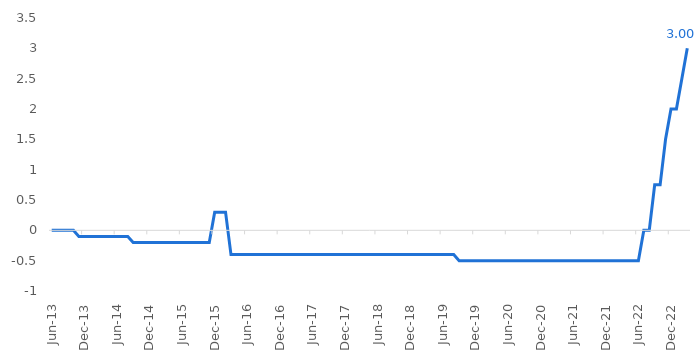
| Category | Taxa de depósito BCE |
|---|---|
| 2013-06-01 | 0 |
| 2013-07-01 | 0 |
| 2013-08-01 | 0 |
| 2013-09-01 | 0 |
| 2013-10-01 | 0 |
| 2013-11-01 | -0.1 |
| 2013-12-01 | -0.1 |
| 2014-01-01 | -0.1 |
| 2014-02-01 | -0.1 |
| 2014-03-01 | -0.1 |
| 2014-04-01 | -0.1 |
| 2014-05-01 | -0.1 |
| 2014-06-01 | -0.1 |
| 2014-07-01 | -0.1 |
| 2014-08-01 | -0.1 |
| 2014-09-01 | -0.2 |
| 2014-10-01 | -0.2 |
| 2014-11-01 | -0.2 |
| 2014-12-01 | -0.2 |
| 2015-01-01 | -0.2 |
| 2015-02-01 | -0.2 |
| 2015-03-01 | -0.2 |
| 2015-04-01 | -0.2 |
| 2015-05-01 | -0.2 |
| 2015-06-01 | -0.2 |
| 2015-07-01 | -0.2 |
| 2015-08-01 | -0.2 |
| 2015-09-01 | -0.2 |
| 2015-10-01 | -0.2 |
| 2015-11-01 | -0.2 |
| 2015-12-01 | 0.3 |
| 2016-01-01 | 0.3 |
| 2016-02-01 | 0.3 |
| 2016-03-01 | -0.4 |
| 2016-04-01 | -0.4 |
| 2016-05-01 | -0.4 |
| 2016-06-01 | -0.4 |
| 2016-07-01 | -0.4 |
| 2016-08-01 | -0.4 |
| 2016-09-01 | -0.4 |
| 2016-10-01 | -0.4 |
| 2016-11-01 | -0.4 |
| 2016-12-01 | -0.4 |
| 2017-01-01 | -0.4 |
| 2017-02-01 | -0.4 |
| 2017-03-01 | -0.4 |
| 2017-04-01 | -0.4 |
| 2017-05-01 | -0.4 |
| 2017-06-01 | -0.4 |
| 2017-07-01 | -0.4 |
| 2017-08-01 | -0.4 |
| 2017-09-01 | -0.4 |
| 2017-10-01 | -0.4 |
| 2017-11-01 | -0.4 |
| 2017-12-01 | -0.4 |
| 2018-01-01 | -0.4 |
| 2018-02-01 | -0.4 |
| 2018-03-01 | -0.4 |
| 2018-04-01 | -0.4 |
| 2018-05-01 | -0.4 |
| 2018-06-01 | -0.4 |
| 2018-07-01 | -0.4 |
| 2018-08-01 | -0.4 |
| 2018-09-01 | -0.4 |
| 2018-10-01 | -0.4 |
| 2018-11-01 | -0.4 |
| 2018-12-01 | -0.4 |
| 2019-01-01 | -0.4 |
| 2019-02-01 | -0.4 |
| 2019-03-01 | -0.4 |
| 2019-04-01 | -0.4 |
| 2019-05-01 | -0.4 |
| 2019-06-01 | -0.4 |
| 2019-07-01 | -0.4 |
| 2019-08-01 | -0.4 |
| 2019-09-01 | -0.5 |
| 2019-10-01 | -0.5 |
| 2019-11-01 | -0.5 |
| 2019-12-01 | -0.5 |
| 2020-01-01 | -0.5 |
| 2020-02-01 | -0.5 |
| 2020-03-01 | -0.5 |
| 2020-04-01 | -0.5 |
| 2020-05-01 | -0.5 |
| 2020-06-01 | -0.5 |
| 2020-07-01 | -0.5 |
| 2020-08-01 | -0.5 |
| 2020-09-01 | -0.5 |
| 2020-10-01 | -0.5 |
| 2020-11-01 | -0.5 |
| 2020-12-01 | -0.5 |
| 2021-01-01 | -0.5 |
| 2021-02-01 | -0.5 |
| 2021-03-01 | -0.5 |
| 2021-04-01 | -0.5 |
| 2021-05-01 | -0.5 |
| 2021-06-01 | -0.5 |
| 2021-07-01 | -0.5 |
| 2021-08-01 | -0.5 |
| 2021-09-01 | -0.5 |
| 2021-10-01 | -0.5 |
| 2021-11-01 | -0.5 |
| 2021-12-01 | -0.5 |
| 2022-01-01 | -0.5 |
| 2022-02-01 | -0.5 |
| 2022-03-01 | -0.5 |
| 2022-04-01 | -0.5 |
| 2022-05-01 | -0.5 |
| 2022-06-01 | -0.5 |
| 2022-07-01 | 0 |
| 2022-08-01 | 0 |
| 2022-09-01 | 0.75 |
| 2022-10-01 | 0.75 |
| 2022-11-01 | 1.5 |
| 2022-12-01 | 2 |
| 2023-01-01 | 2 |
| 2023-02-01 | 2.5 |
| 2023-03-01 | 3 |